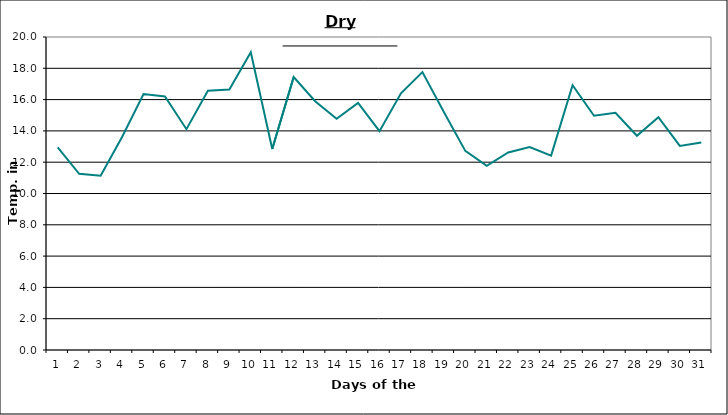
| Category | Series 0 |
|---|---|
| 0 | 12.94 |
| 1 | 11.26 |
| 2 | 11.13 |
| 3 | 13.61 |
| 4 | 16.36 |
| 5 | 16.2 |
| 6 | 14.11 |
| 7 | 16.57 |
| 8 | 16.65 |
| 9 | 19.02 |
| 10 | 12.84 |
| 11 | 17.44 |
| 12 | 15.9 |
| 13 | 14.77 |
| 14 | 15.79 |
| 15 | 13.98 |
| 16 | 16.4 |
| 17 | 17.76 |
| 18 | 15.21 |
| 19 | 12.72 |
| 20 | 11.77 |
| 21 | 12.62 |
| 22 | 12.97 |
| 23 | 12.42 |
| 24 | 16.92 |
| 25 | 14.97 |
| 26 | 15.16 |
| 27 | 13.69 |
| 28 | 14.88 |
| 29 | 13.04 |
| 30 | 13.26 |